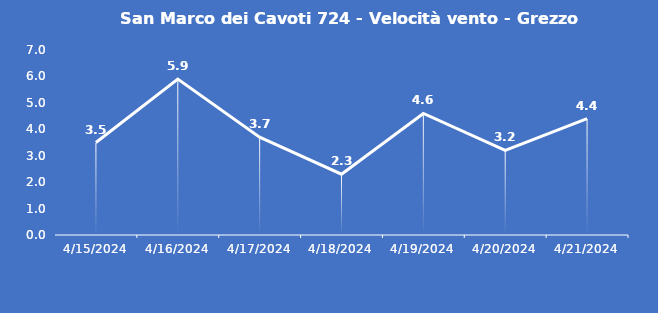
| Category | San Marco dei Cavoti 724 - Velocità vento - Grezzo (m/s) |
|---|---|
| 4/15/24 | 3.5 |
| 4/16/24 | 5.9 |
| 4/17/24 | 3.7 |
| 4/18/24 | 2.3 |
| 4/19/24 | 4.6 |
| 4/20/24 | 3.2 |
| 4/21/24 | 4.4 |